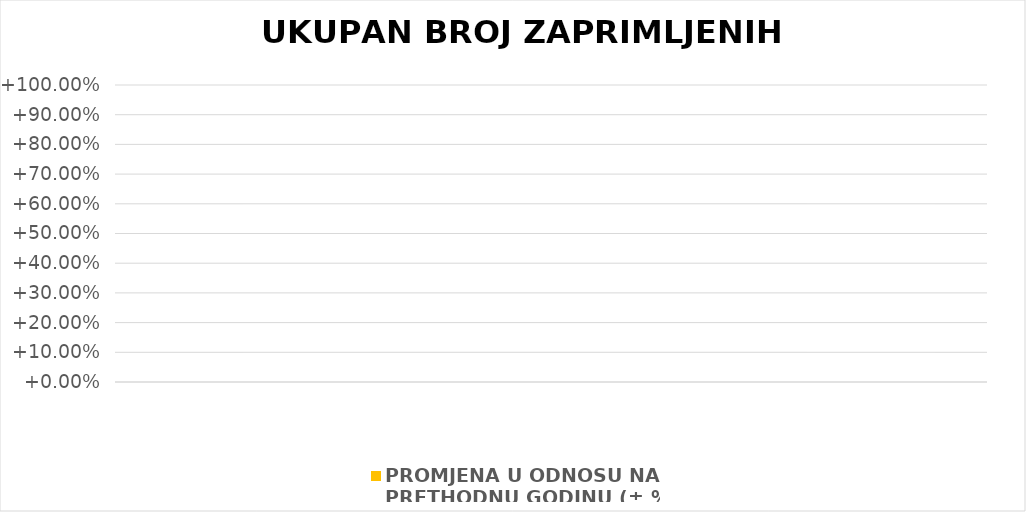
| Category | PROMJENA U ODNOSU NA 
PRETHODNU GODINU (± %) |
|---|---|
|  | 0 |
|  | 0 |
|  | 0 |